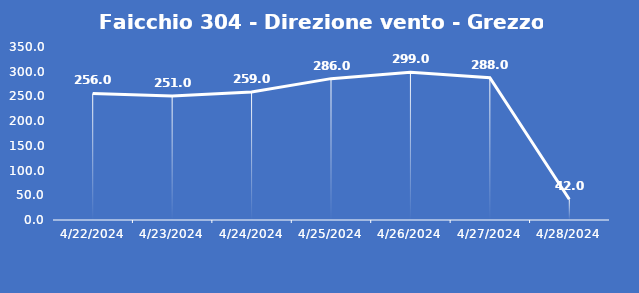
| Category | Faicchio 304 - Direzione vento - Grezzo (°N) |
|---|---|
| 4/22/24 | 256 |
| 4/23/24 | 251 |
| 4/24/24 | 259 |
| 4/25/24 | 286 |
| 4/26/24 | 299 |
| 4/27/24 | 288 |
| 4/28/24 | 42 |